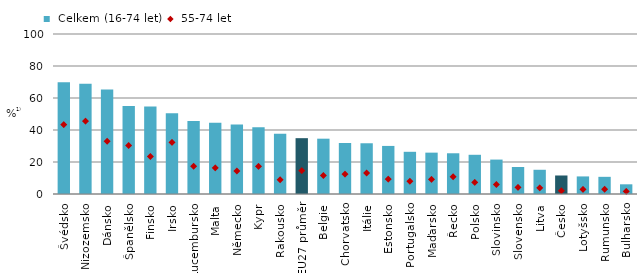
| Category |  Celkem (16-74 let) |
|---|---|
| Švédsko | 69.915 |
| Nizozemsko | 68.893 |
| Dánsko | 65.306 |
| Španělsko | 55.074 |
| Finsko | 54.63 |
| Irsko | 50.391 |
| Lucembursko | 45.68 |
| Malta | 44.579 |
| Německo | 43.419 |
| Kypr | 41.765 |
| Rakousko | 37.66 |
| EU27 průměr | 34.894 |
| Belgie | 34.574 |
| Chorvatsko | 31.872 |
| Itálie | 31.712 |
| Estonsko | 30.046 |
| Portugalsko | 26.376 |
| Maďarsko | 25.847 |
| Řecko | 25.457 |
| Polsko | 24.507 |
| Slovinsko | 21.514 |
| Slovensko | 16.892 |
| Litva | 15.138 |
| Česko | 11.57 |
| Lotyšsko | 10.984 |
| Rumunsko | 10.731 |
| Bulharsko | 6.061 |